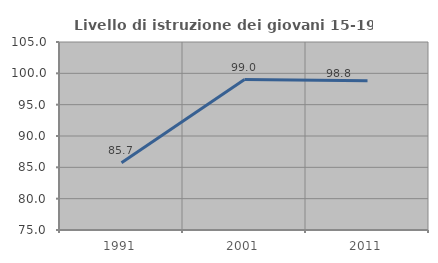
| Category | Livello di istruzione dei giovani 15-19 anni |
|---|---|
| 1991.0 | 85.714 |
| 2001.0 | 99 |
| 2011.0 | 98.824 |